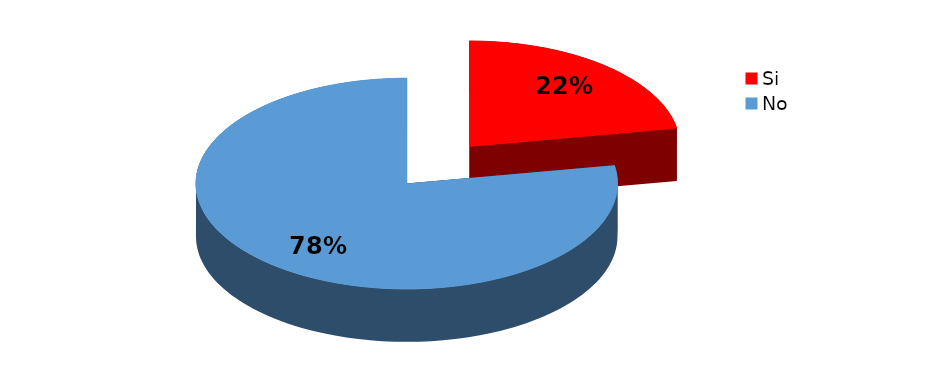
| Category | Series 0 |
|---|---|
| Si | 2 |
| No | 7 |